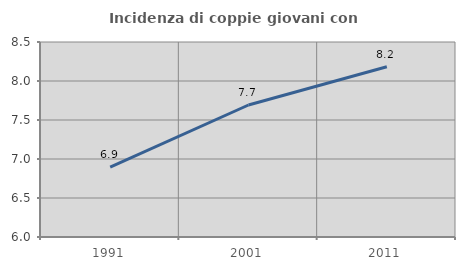
| Category | Incidenza di coppie giovani con figli |
|---|---|
| 1991.0 | 6.897 |
| 2001.0 | 7.692 |
| 2011.0 | 8.182 |